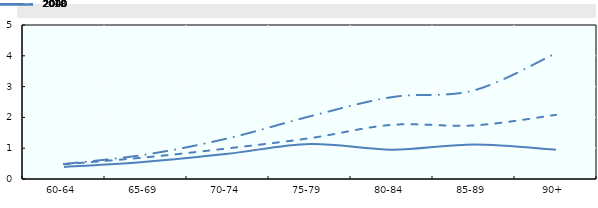
| Category | 2000 | 2018 | 2040 |
|---|---|---|---|
| 60-64 | 0.389 | 0.479 | 0.486 |
| 65-69 | 0.561 | 0.704 | 0.794 |
| 70-74 | 0.822 | 0.995 | 1.321 |
| 75-79 | 1.136 | 1.326 | 2.035 |
| 80-84 | 0.953 | 1.759 | 2.659 |
| 85-89 | 1.12 | 1.74 | 2.878 |
| 90+ | 0.951 | 2.082 | 4.085 |